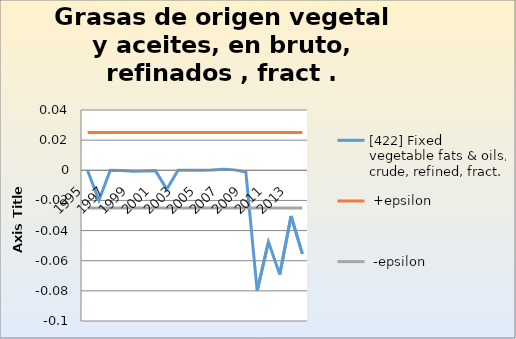
| Category | [422] Fixed vegetable fats & oils, crude, refined, fract. |  +epsilon |  -epsilon |
|---|---|---|---|
| 1995.0 | 0 | 0.025 | -0.025 |
| 1996.0 | -0.02 | 0.025 | -0.025 |
| 1997.0 | 0 | 0.025 | -0.025 |
| 1998.0 | 0 | 0.025 | -0.025 |
| 1999.0 | -0.001 | 0.025 | -0.025 |
| 2000.0 | -0.001 | 0.025 | -0.025 |
| 2001.0 | 0 | 0.025 | -0.025 |
| 2002.0 | -0.013 | 0.025 | -0.025 |
| 2003.0 | 0 | 0.025 | -0.025 |
| 2004.0 | 0 | 0.025 | -0.025 |
| 2005.0 | 0 | 0.025 | -0.025 |
| 2006.0 | 0 | 0.025 | -0.025 |
| 2007.0 | 0.001 | 0.025 | -0.025 |
| 2008.0 | 0 | 0.025 | -0.025 |
| 2009.0 | -0.001 | 0.025 | -0.025 |
| 2010.0 | -0.08 | 0.025 | -0.025 |
| 2011.0 | -0.047 | 0.025 | -0.025 |
| 2012.0 | -0.069 | 0.025 | -0.025 |
| 2013.0 | -0.03 | 0.025 | -0.025 |
| 2014.0 | -0.055 | 0.025 | -0.025 |